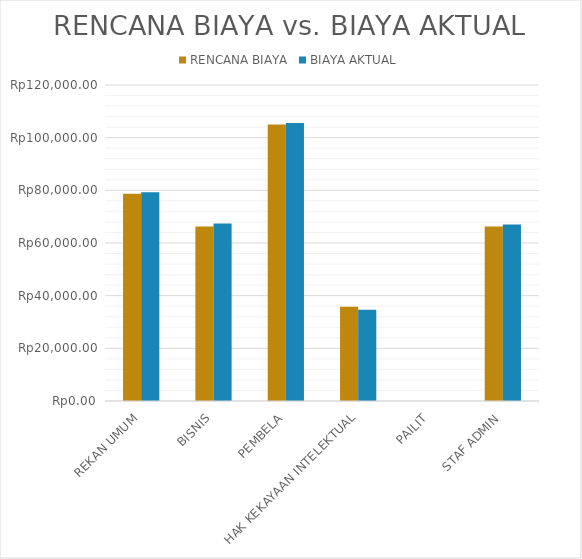
| Category | RENCANA BIAYA | BIAYA AKTUAL |
|---|---|---|
| REKAN UMUM | 78750 | 79275 |
| BISNIS | 66250 | 67375 |
| PEMBELA | 105000 | 105600 |
| HAK KEKAYAAN INTELEKTUAL | 35750 | 34650 |
| PAILIT | 0 | 0 |
| STAF ADMIN | 66250 | 67000 |